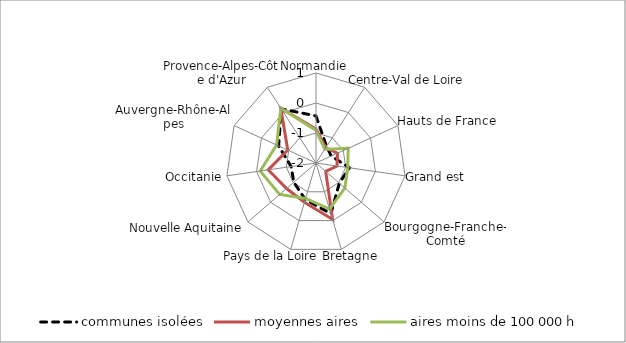
| Category | communes isolées | moyennes aires | aires moins de 100 000 h |
|---|---|---|---|
| Normandie | -0.431 | -0.869 | -0.913 |
| Centre-Val de Loire | -1.348 | -1.397 | -1.457 |
| Hauts de France | -1.441 | -1.212 | -0.819 |
| Grand est | -0.875 | -1.294 | -0.931 |
| Bourgogne-Franche-Comté | -0.971 | -1.572 | -0.726 |
| Bretagne | -0.239 | -0.04 | -0.401 |
| Pays de la Loire | -0.731 | -0.634 | -0.769 |
| Nouvelle Aquitaine | -1.022 | -0.702 | -0.399 |
| Occitanie | -1.163 | -0.39 | -0.121 |
| Auvergne-Rhône-Alpes | -0.631 | -0.965 | -0.556 |
| Provence-Alpes-Côte d'Azur | 0.147 | 0.172 | 0.168 |